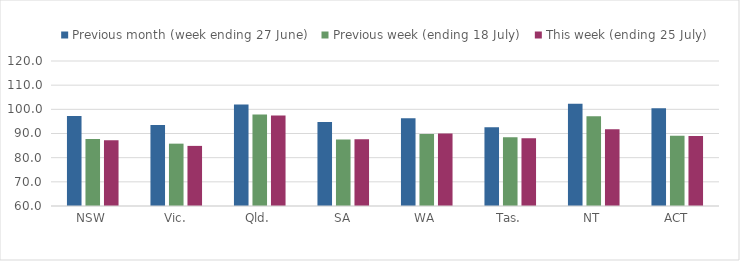
| Category | Previous month (week ending 27 June) | Previous week (ending 18 July) | This week (ending 25 July) |
|---|---|---|---|
| NSW | 97.227 | 87.694 | 87.207 |
| Vic. | 93.565 | 85.799 | 84.872 |
| Qld. | 101.962 | 97.82 | 97.472 |
| SA | 94.77 | 87.509 | 87.587 |
| WA | 96.266 | 89.81 | 89.95 |
| Tas. | 92.637 | 88.479 | 88.065 |
| NT | 102.31 | 97.14 | 91.789 |
| ACT | 100.474 | 89.1 | 88.948 |